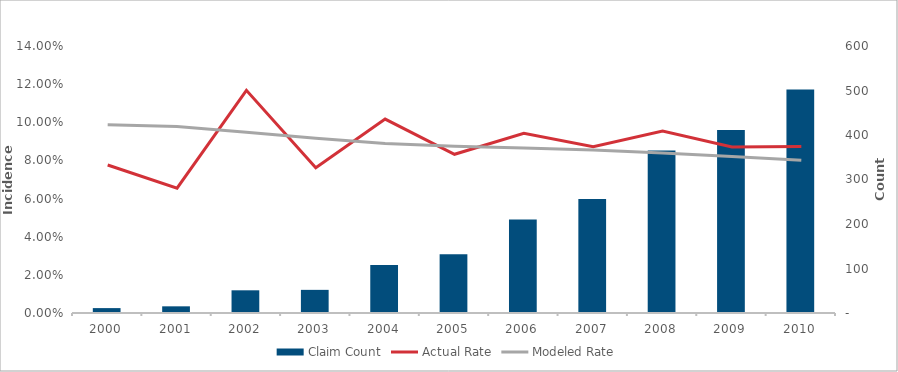
| Category | Claim Count |
|---|---|
| 2000.0 | 11 |
| 2001.0 | 15 |
| 2002.0 | 51 |
| 2003.0 | 52 |
| 2004.0 | 108 |
| 2005.0 | 132 |
| 2006.0 | 210 |
| 2007.0 | 256 |
| 2008.0 | 365 |
| 2009.0 | 411 |
| 2010.0 | 502 |